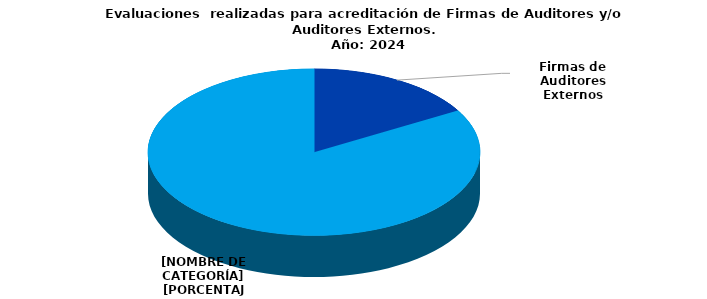
| Category | Series 0 |
|---|---|
| Firmas de Auditores Externos | 4 |
| Auditores Externos | 20 |